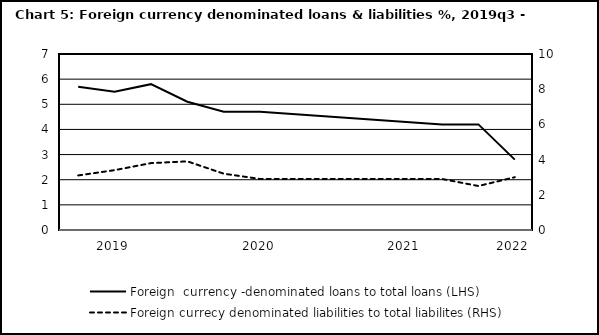
| Category | Foreign  currency -denominated loans to total loans (LHS) |
|---|---|
| nan | 5.7 |
| 2019.0 | 5.5 |
| nan | 5.8 |
| nan | 5.1 |
| nan | 4.7 |
| 2020.0 | 4.7 |
| nan | 0 |
| nan | 0 |
| nan | 0 |
| 2021.0 | 0 |
| nan | 4.2 |
| nan | 4.2 |
| 2022.0 | 2.8 |